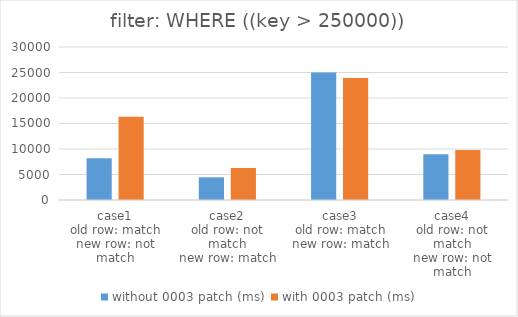
| Category | without 0003 patch (ms) | with 0003 patch (ms) |
|---|---|---|
| case1
old row: match
new row: not match | 8180.552 | 16299.683 |
| case2
old row: not match
new row: match | 4449.321 | 6272.67 |
| case3
old row: match
new row: match | 24979.604 | 23923.448 |
| case4
old row: not match
new row: not match | 8980.465 | 9799.685 |